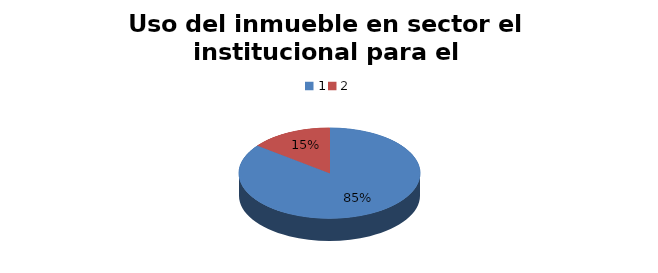
| Category | Total departamento |
|---|---|
| 0 | 0.854 |
| 1 | 0.146 |